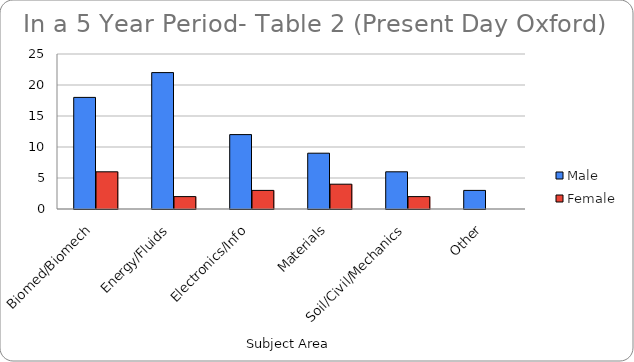
| Category | Male | Female |
|---|---|---|
| Biomed/Biomech | 18 | 6 |
| Energy/Fluids | 22 | 2 |
| Electronics/Info | 12 | 3 |
| Materials | 9 | 4 |
| Soil/Civil/Mechanics | 6 | 2 |
| Other | 3 | 0 |